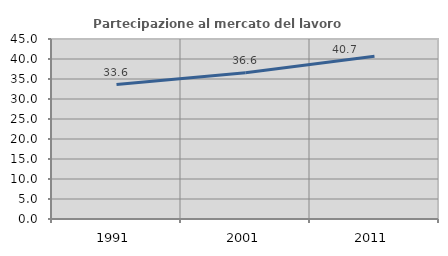
| Category | Partecipazione al mercato del lavoro  femminile |
|---|---|
| 1991.0 | 33.609 |
| 2001.0 | 36.556 |
| 2011.0 | 40.705 |